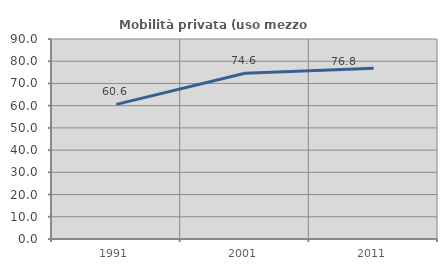
| Category | Mobilità privata (uso mezzo privato) |
|---|---|
| 1991.0 | 60.582 |
| 2001.0 | 74.594 |
| 2011.0 | 76.819 |